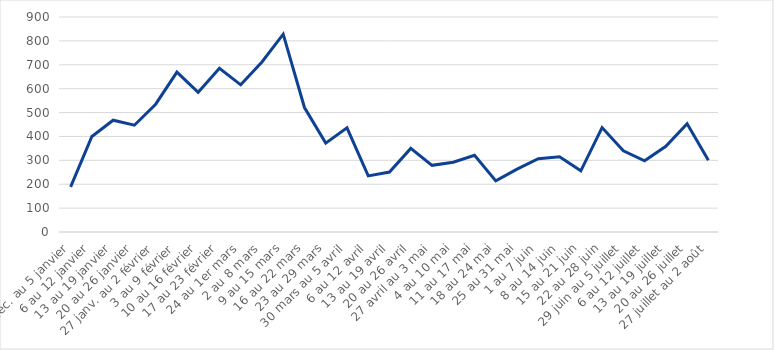
| Category | 2020 |
|---|---|
| 30 déc. au 5 janvier | 189 |
| 6 au 12 janvier | 400 |
| 13 au 19 janvier | 468 |
| 20 au 26 janvier | 447 |
| 27 janv. au 2 février | 535 |
| 3 au 9 février | 669 |
| 10 au 16 février | 585 |
| 17 au 23 février | 685 |
| 24 au 1er mars | 616 |
| 2 au 8 mars | 712 |
| 9 au 15 mars | 828 |
| 16 au 22 mars | 521 |
| 23 au 29 mars | 372 |
| 30 mars au 5 avril | 436 |
| 6 au 12 avril | 235 |
| 13 au 19 avril | 251 |
| 20 au 26 avril | 350 |
| 27 avril au 3 mai | 279 |
| 4 au 10 mai | 292 |
| 11 au 17 mai | 321 |
| 18 au 24 mai | 214 |
| 25 au 31 mai | 263 |
| 1 au 7 juin | 307 |
| 8 au 14 juin | 315 |
| 15 au 21 juin | 256 |
| 22 au 28 juin | 437 |
| 29 juin au 5 juillet | 340 |
| 6 au 12 juillet | 298 |
| 13 au 19 juillet | 359 |
| 20 au 26 juillet | 453 |
| 27 juillet au 2 août | 300 |